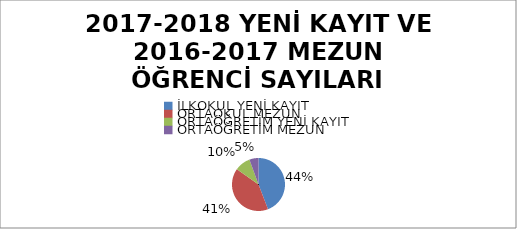
| Category | Series 0 |
|---|---|
| İLKOKUL YENİ KAYIT  | 7897 |
| ORTAOKUL MEZUN | 7268 |
| ORTAÖĞRETİM YENİ KAYIT  | 1725 |
| ORTAÖĞRETİM MEZUN  | 994 |